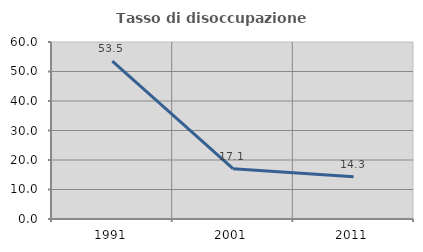
| Category | Tasso di disoccupazione giovanile  |
|---|---|
| 1991.0 | 53.488 |
| 2001.0 | 17.073 |
| 2011.0 | 14.286 |